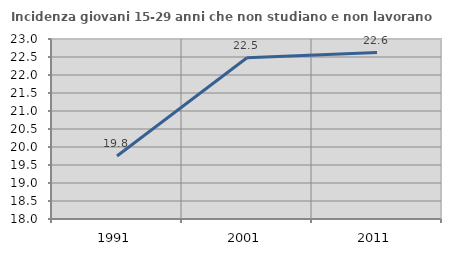
| Category | Incidenza giovani 15-29 anni che non studiano e non lavorano  |
|---|---|
| 1991.0 | 19.75 |
| 2001.0 | 22.478 |
| 2011.0 | 22.624 |